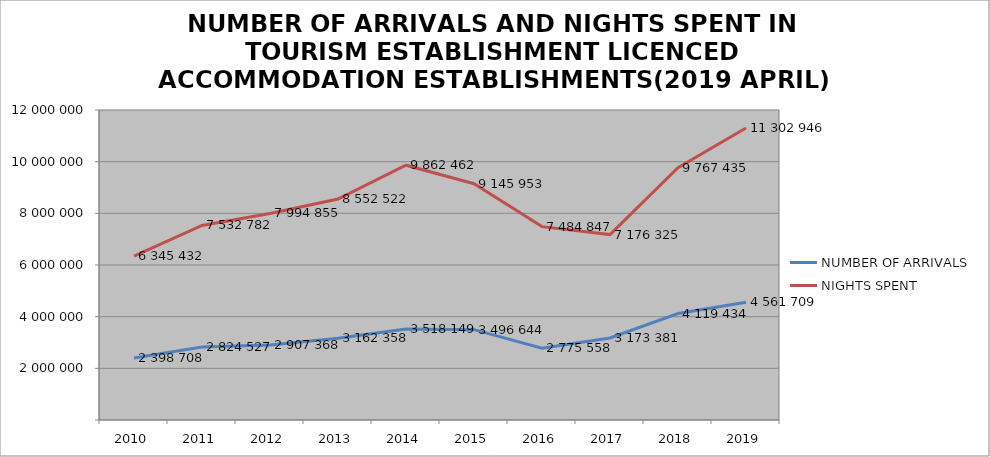
| Category | NUMBER OF ARRIVALS | NIGHTS SPENT |
|---|---|---|
| 2010 | 2398708 | 6345432 |
| 2011 | 2824527 | 7532782 |
| 2012 | 2907368 | 7994855 |
| 2013 | 3162358 | 8552522 |
| 2014 | 3518149 | 9862462 |
| 2015 | 3496644 | 9145953 |
| 2016 | 2775558 | 7484847 |
| 2017 | 3173381 | 7176325 |
| 2018 | 4119434 | 9767435 |
| 2019 | 4561709 | 11302946 |